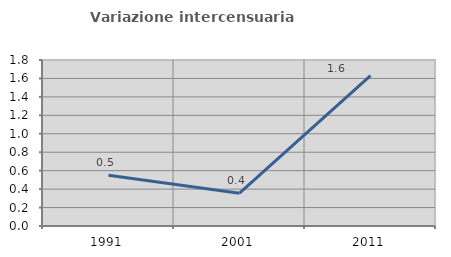
| Category | Variazione intercensuaria annua |
|---|---|
| 1991.0 | 0.55 |
| 2001.0 | 0.355 |
| 2011.0 | 1.63 |